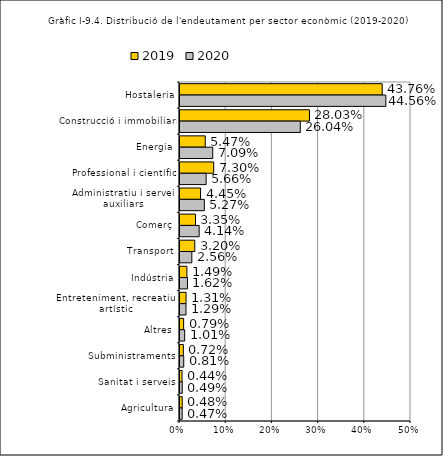
| Category | 2019 | 2020 |
|---|---|---|
| Hostaleria | 0.438 | 0.446 |
| Construcció i immobiliari | 0.28 | 0.26 |
| Energia | 0.055 | 0.071 |
| Professional i científic | 0.073 | 0.057 |
| Administratiu i serveis auxiliars | 0.045 | 0.053 |
| Comerç | 0.034 | 0.041 |
| Transport | 0.032 | 0.026 |
| Indústria | 0.015 | 0.016 |
| Entreteniment, recreatiu i artístic | 0.013 | 0.013 |
| Altres | 0.008 | 0.01 |
| Subministraments | 0.007 | 0.008 |
| Sanitat i serveis | 0.004 | 0.005 |
| Agricultura | 0.005 | 0.005 |